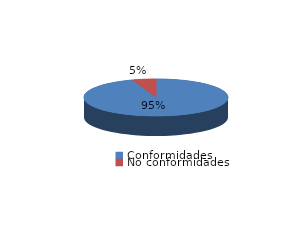
| Category | Series 0 |
|---|---|
| Conformidades | 550 |
| No conformidades | 31 |